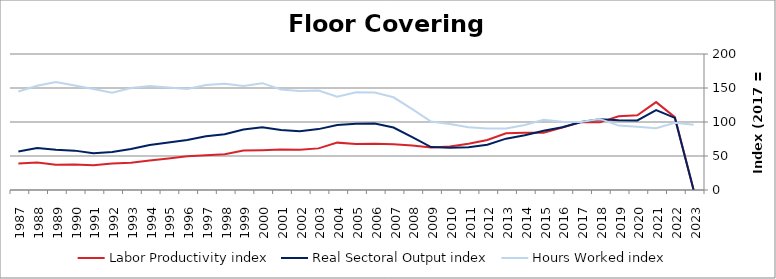
| Category | Labor Productivity index | Real Sectoral Output index | Hours Worked index |
|---|---|---|---|
| 2023.0 | 0 | 0 | 96.124 |
| 2022.0 | 107.166 | 106.003 | 98.915 |
| 2021.0 | 129.231 | 117.48 | 90.907 |
| 2020.0 | 109.801 | 102.26 | 93.132 |
| 2019.0 | 108.342 | 102.649 | 94.745 |
| 2018.0 | 99.49 | 103.983 | 104.516 |
| 2017.0 | 100 | 100 | 100 |
| 2016.0 | 91.933 | 92.39 | 100.497 |
| 2015.0 | 84.33 | 87.132 | 103.323 |
| 2014.0 | 84.21 | 80.566 | 95.672 |
| 2013.0 | 83.441 | 75.501 | 90.484 |
| 2012.0 | 73.592 | 66.541 | 90.418 |
| 2011.0 | 68.053 | 62.752 | 92.211 |
| 2010.0 | 63.908 | 62.123 | 97.206 |
| 2009.0 | 62.681 | 63.14 | 100.734 |
| 2008.0 | 65.571 | 77.913 | 118.824 |
| 2007.0 | 67.401 | 91.884 | 136.325 |
| 2006.0 | 68.173 | 97.633 | 143.214 |
| 2005.0 | 67.624 | 97.27 | 143.839 |
| 2004.0 | 69.662 | 95.497 | 137.087 |
| 2003.0 | 61.205 | 89.549 | 146.31 |
| 2002.0 | 59.329 | 86.344 | 145.534 |
| 2001.0 | 59.642 | 88.145 | 147.789 |
| 2000.0 | 58.614 | 92.087 | 157.108 |
| 1999.0 | 58.165 | 89.01 | 153.03 |
| 1998.0 | 52.474 | 81.955 | 156.183 |
| 1997.0 | 51.183 | 79.063 | 154.472 |
| 1996.0 | 49.559 | 73.652 | 148.615 |
| 1995.0 | 46.449 | 69.995 | 150.692 |
| 1994.0 | 43.263 | 66.203 | 153.025 |
| 1993.0 | 40.169 | 60.26 | 150.017 |
| 1992.0 | 39.047 | 55.797 | 142.897 |
| 1991.0 | 36.491 | 54.191 | 148.505 |
| 1990.0 | 37.671 | 57.898 | 153.694 |
| 1989.0 | 37.184 | 59.08 | 158.887 |
| 1988.0 | 40.297 | 61.78 | 153.312 |
| 1987.0 | 39.1 | 56.595 | 144.744 |